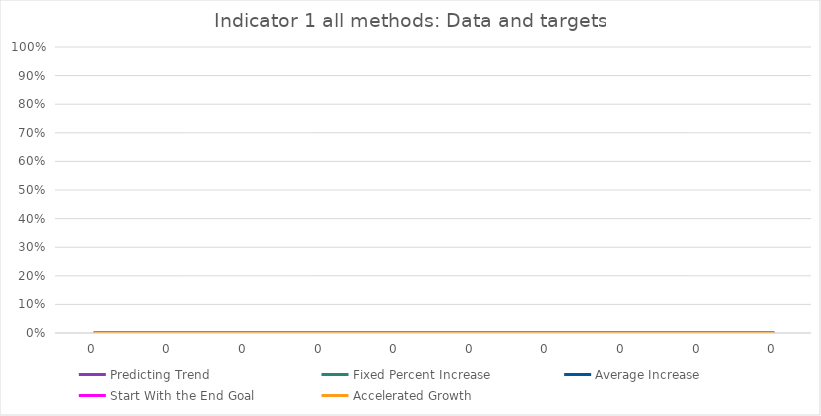
| Category | Predicting Trend | Fixed Percent Increase | Average Increase | Start With the End Goal | Accelerated Growth |
|---|---|---|---|---|---|
| 0.0 | 0 | 0 | 0 | 0 | 0 |
| 0.0 | 0 | 0 | 0 | 0 | 0 |
| 0.0 | 0 | 0 | 0 | 0 | 0 |
| 0.0 | 0 | 0 | 0 | 0 | 0 |
| 0.0 | 0 | 0 | 0 | 0 | 0 |
| 0.0 | 0 | 0 | 0 | 0 | 0 |
| 0.0 | 0 | 0 | 0 | 0 | 0 |
| 0.0 | 0 | 0 | 0 | 0 | 0 |
| 0.0 | 0 | 0 | 0 | 0 | 0 |
| 0.0 | 0 | 0 | 0 | 0 | 0 |